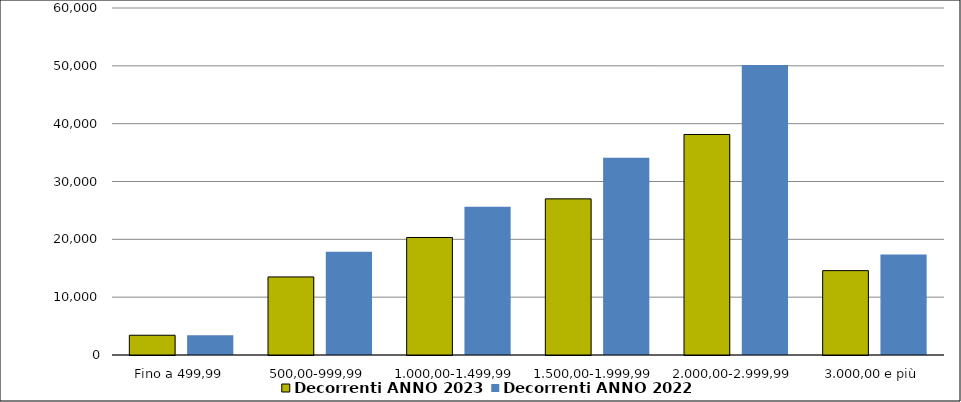
| Category | Decorrenti ANNO 2023 | Decorrenti ANNO 2022 |
|---|---|---|
|  Fino a 499,99  | 3415 | 3407 |
|  500,00-999,99  | 13500 | 17856 |
|  1.000,00-1.499,99  | 20322 | 25627 |
|  1.500,00-1.999,99  | 26998 | 34105 |
|  2.000,00-2.999,99  | 38130 | 50153 |
|  3.000,00 e più  | 14587 | 17396 |